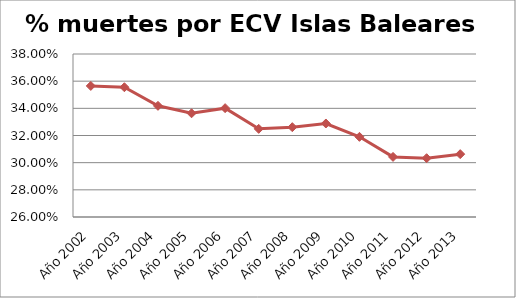
| Category | Series 0 |
|---|---|
| Año 2002 | 0.356 |
| Año 2003 | 0.356 |
| Año 2004 | 0.342 |
| Año 2005 | 0.336 |
| Año 2006 | 0.34 |
| Año 2007 | 0.325 |
| Año 2008 | 0.326 |
| Año 2009 | 0.329 |
| Año 2010 | 0.319 |
| Año 2011 | 0.304 |
| Año 2012 | 0.303 |
| Año 2013 | 0.306 |